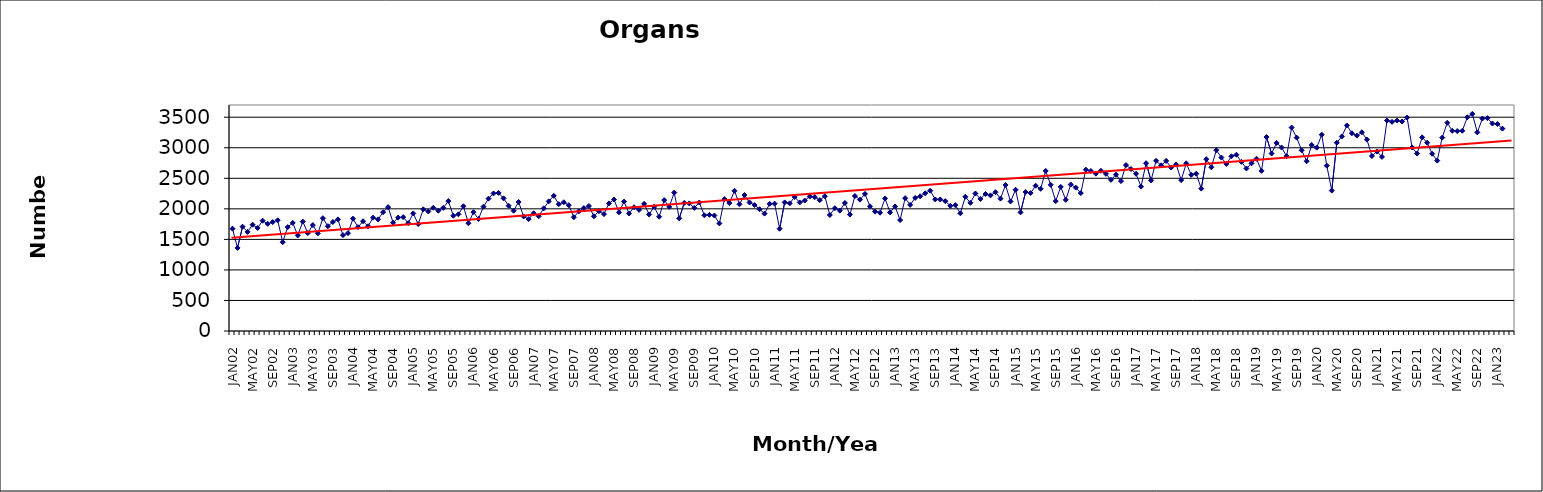
| Category | Series 0 |
|---|---|
| JAN02 | 1675 |
| FEB02 | 1360 |
| MAR02 | 1708 |
| APR02 | 1623 |
| MAY02 | 1740 |
| JUN02 | 1687 |
| JUL02 | 1806 |
| AUG02 | 1755 |
| SEP02 | 1783 |
| OCT02 | 1813 |
| NOV02 | 1455 |
| DEC02 | 1701 |
| JAN03 | 1770 |
| FEB03 | 1565 |
| MAR03 | 1791 |
| APR03 | 1603 |
| MAY03 | 1734 |
| JUN03 | 1598 |
| JUL03 | 1847 |
| AUG03 | 1716 |
| SEP03 | 1785 |
| OCT03 | 1827 |
| NOV03 | 1570 |
| DEC03 | 1602 |
| JAN04 | 1839 |
| FEB04 | 1700 |
| MAR04 | 1797 |
| APR04 | 1715 |
| MAY04 | 1855 |
| JUN04 | 1827 |
| JUL04 | 1945 |
| AUG04 | 2028 |
| SEP04 | 1773 |
| OCT04 | 1857 |
| NOV04 | 1864 |
| DEC04 | 1766 |
| JAN05 | 1925 |
| FEB05 | 1750 |
| MAR05 | 1993 |
| APR05 | 1957 |
| MAY05 | 2018 |
| JUN05 | 1969 |
| JUL05 | 2016 |
| AUG05 | 2127 |
| SEP05 | 1888 |
| OCT05 | 1910 |
| NOV05 | 2042 |
| DEC05 | 1764 |
| JAN06 | 1945 |
| FEB06 | 1834 |
| MAR06 | 2035 |
| APR06 | 2167 |
| MAY06 | 2252 |
| JUN06 | 2261 |
| JUL06 | 2172 |
| AUG06 | 2051 |
| SEP06 | 1969 |
| OCT06 | 2111 |
| NOV06 | 1875 |
| DEC06 | 1832 |
| JAN07 | 1927 |
| FEB07 | 1878 |
| MAR07 | 2009 |
| APR07 | 2122 |
| MAY07 | 2214 |
| JUN07 | 2076 |
| JUL07 | 2108 |
| AUG07 | 2060 |
| SEP07 | 1863 |
| OCT07 | 1959 |
| NOV07 | 2012 |
| DEC07 | 2046 |
| JAN08 | 1878 |
| FEB08 | 1962 |
| MAR08 | 1914 |
| APR08 | 2089 |
| MAY08 | 2153 |
| JUN08 | 1942 |
| JUL08 | 2119 |
| AUG08 | 1923 |
| SEP08 | 2026 |
| OCT08 | 1983 |
| NOV08 | 2082 |
| DEC08 | 1908 |
| JAN09 | 2033 |
| FEB09 | 1871 |
| MAR09 | 2143 |
| APR09 | 2032 |
| MAY09 | 2266 |
| JUN09 | 1844 |
| JUL09 | 2096 |
| AUG09 | 2089 |
| SEP09 | 2016 |
| OCT09 | 2104 |
| NOV09 | 1894 |
| DEC09 | 1901 |
| JAN10 | 1890 |
| FEB10 | 1761 |
| MAR10 | 2160 |
| APR10 | 2094 |
| MAY10 | 2295 |
| JUN10 | 2075 |
| JUL10 | 2226 |
| AUG10 | 2104 |
| SEP10 | 2062 |
| OCT10 | 1994 |
| NOV10 | 1922 |
| DEC10 | 2082 |
| JAN11 | 2085 |
| FEB11 | 1674 |
| MAR11 | 2106 |
| APR11 | 2090 |
| MAY11 | 2194 |
| JUN11 | 2105 |
| JUL11 | 2136 |
| AUG11 | 2202 |
| SEP11 | 2192 |
| OCT11 | 2142 |
| NOV11 | 2207 |
| DEC11 | 1899 |
| JAN12 | 2011 |
| FEB12 | 1970 |
| MAR12 | 2096 |
| APR12 | 1906 |
| MAY12 | 2210 |
| JUN12 | 2150 |
| JUL12 | 2244 |
| AUG12 | 2041 |
| SEP12 | 1954 |
| OCT12 | 1936 |
| NOV12 | 2170 |
| DEC12 | 1941 |
| JAN13 | 2039 |
| FEB13 | 1816 |
| MAR13 | 2175 |
| APR13 | 2065 |
| MAY13 | 2179 |
| JUN13 | 2205 |
| JUL13 | 2254 |
| AUG13 | 2297 |
| SEP13 | 2154 |
| OCT13 | 2154 |
| NOV13 | 2126 |
| DEC13 | 2049 |
| JAN14 | 2061 |
| FEB14 | 1927 |
| MAR14 | 2197 |
| APR14 | 2098 |
| MAY14 | 2251 |
| JUN14 | 2162 |
| JUL14 | 2243 |
| AUG14 | 2220 |
| SEP14 | 2272 |
| OCT14 | 2167 |
| NOV14 | 2391 |
| DEC14 | 2121 |
| JAN15 | 2312 |
| FEB15 | 1942 |
| MAR15 | 2275 |
| APR15 | 2259 |
| MAY15 | 2379 |
| JUN15 | 2328 |
| JUL15 | 2621 |
| AUG15 | 2393 |
| SEP15 | 2127 |
| OCT15 | 2359 |
| NOV15 | 2147 |
| DEC15 | 2398 |
| JAN16 | 2348 |
| FEB16 | 2258 |
| MAR16 | 2642 |
| APR16 | 2619 |
| MAY16 | 2576 |
| JUN16 | 2623 |
| JUL16 | 2573 |
| AUG16 | 2475 |
| SEP16 | 2559 |
| OCT16 | 2455 |
| NOV16 | 2717 |
| DEC16 | 2652 |
| JAN17 | 2574 |
| FEB17 | 2364 |
| MAR17 | 2747 |
| APR17 | 2466 |
| MAY17 | 2786 |
| JUN17 | 2712 |
| JUL17 | 2785 |
| AUG17 | 2676 |
| SEP17 | 2726 |
| OCT17 | 2470 |
| NOV17 | 2745 |
| DEC17 | 2557 |
| JAN18 | 2575 |
| FEB18 | 2331 |
| MAR18 | 2813 |
| APR18 | 2681 |
| MAY18 | 2960 |
| JUN18 | 2839 |
| JUL18 | 2735 |
| AUG18 | 2860 |
| SEP18 | 2886 |
| OCT18 | 2769 |
| NOV18 | 2661 |
| DEC18 | 2745 |
| JAN19 | 2819 |
| FEB19 | 2622 |
| MAR19 | 3175 |
| APR19 | 2906 |
| MAY19 | 3079 |
| JUN19 | 3004 |
| JUL19 | 2863 |
| AUG19 | 3330 |
| SEP19 | 3166 |
| OCT19 | 2958 |
| NOV19 | 2779 |
| DEC19 | 3045 |
| JAN20 | 3002 |
| FEB20 | 3214 |
| MAR20 | 2707 |
| APR20 | 2299 |
| MAY20 | 3082 |
| JUN20 | 3185 |
| JUL20 | 3365 |
| AUG20 | 3238 |
| SEP20 | 3199 |
| OCT20 | 3253 |
| NOV20 | 3133 |
| DEC20 | 2865 |
| JAN21 | 2939 |
| FEB21 | 2850 |
| MAR21 | 3446 |
| APR21 | 3424 |
| MAY21 | 3446 |
| JUN21 | 3429 |
| JUL21 | 3494 |
| AUG21 | 3006 |
| SEP21 | 2905 |
| OCT21 | 3170 |
| NOV21 | 3083 |
| DEC21 | 2902 |
| JAN22 | 2790 |
| FEB22 | 3166 |
| MAR22 | 3409 |
| APR22 | 3278 |
| MAY22 | 3273 |
| JUN22 | 3278 |
| JUL22 | 3499 |
| AUG22 | 3554 |
| SEP22 | 3252 |
| OCT22 | 3478 |
| NOV22 | 3485 |
| DEC22 | 3397 |
| JAN23 | 3388 |
| FEB23 | 3313 |